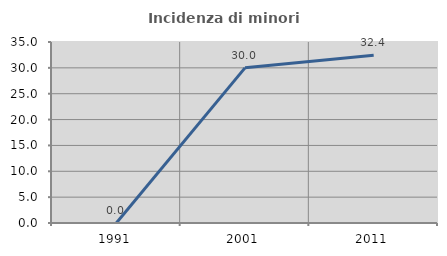
| Category | Incidenza di minori stranieri |
|---|---|
| 1991.0 | 0 |
| 2001.0 | 30 |
| 2011.0 | 32.432 |